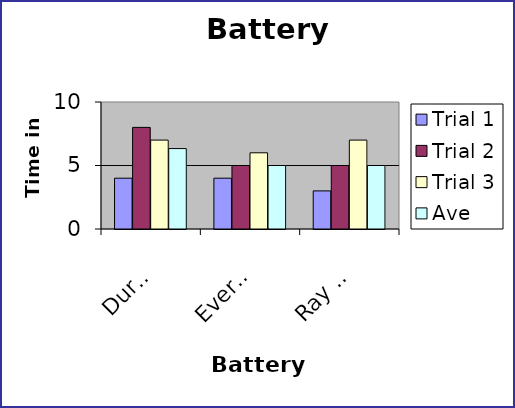
| Category | Trial 1 | Trial 2 | Trial 3 | Ave |
|---|---|---|---|---|
| Dura Cell | 4 | 8 | 7 | 6.333 |
| Everyready | 4 | 5 | 6 | 5 |
| Ray O Vac | 3 | 5 | 7 | 5 |